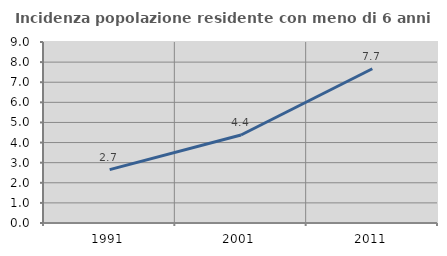
| Category | Incidenza popolazione residente con meno di 6 anni |
|---|---|
| 1991.0 | 2.655 |
| 2001.0 | 4.375 |
| 2011.0 | 7.669 |